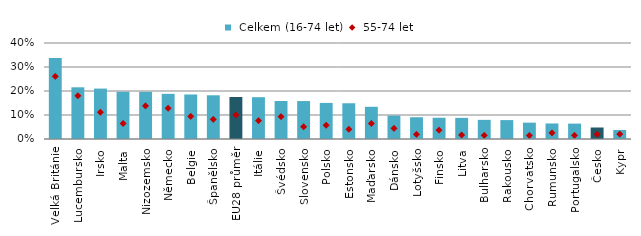
| Category |  Celkem (16-74 let) |
|---|---|
| Velká Británie | 0.337 |
| Lucembursko | 0.215 |
| Irsko | 0.21 |
| Malta | 0.197 |
| Nizozemsko | 0.196 |
| Německo | 0.188 |
| Belgie | 0.185 |
| Španělsko | 0.182 |
| EU28 průměr | 0.175 |
| Itálie | 0.174 |
| Švédsko | 0.158 |
| Slovensko | 0.158 |
| Polsko | 0.15 |
| Estonsko | 0.149 |
| Maďarsko | 0.134 |
| Dánsko | 0.098 |
| Lotyšsko | 0.091 |
| Finsko | 0.089 |
| Litva | 0.088 |
| Bulharsko | 0.08 |
| Rakousko | 0.079 |
| Chorvatsko | 0.068 |
| Rumunsko | 0.065 |
| Portugalsko | 0.064 |
| Česko | 0.048 |
| Kypr | 0.038 |